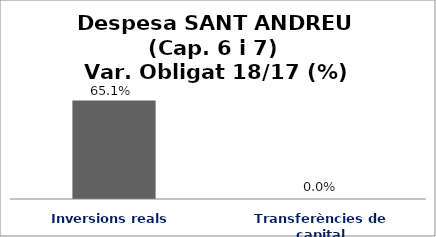
| Category | Series 0 |
|---|---|
| Inversions reals | 0.651 |
| Transferències de capital | 0 |